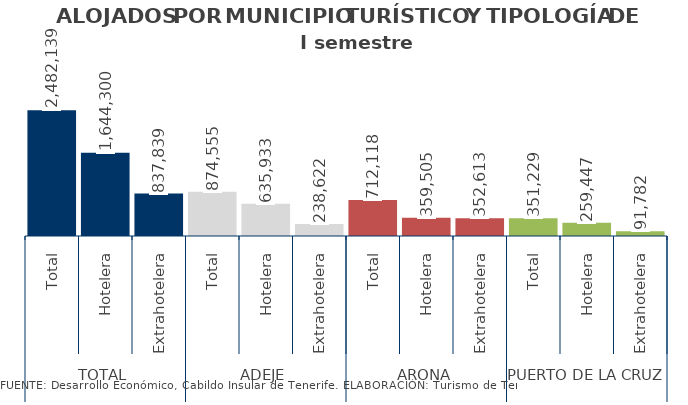
| Category | I semestre 2014 |
|---|---|
| 0 | 2482139 |
| 1 | 1644300 |
| 2 | 837839 |
| 3 | 874555 |
| 4 | 635933 |
| 5 | 238622 |
| 6 | 712118 |
| 7 | 359505 |
| 8 | 352613 |
| 9 | 351229 |
| 10 | 259447 |
| 11 | 91782 |